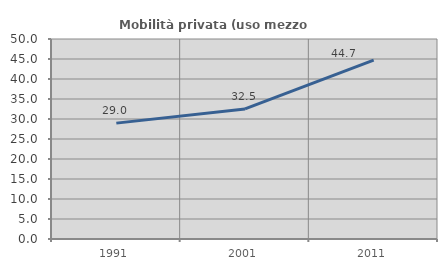
| Category | Mobilità privata (uso mezzo privato) |
|---|---|
| 1991.0 | 28.967 |
| 2001.0 | 32.512 |
| 2011.0 | 44.725 |